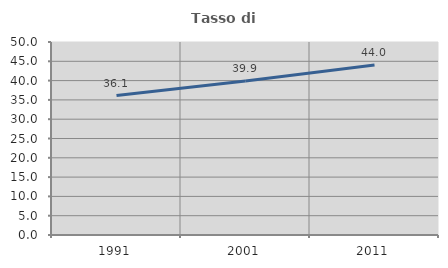
| Category | Tasso di occupazione   |
|---|---|
| 1991.0 | 36.117 |
| 2001.0 | 39.873 |
| 2011.0 | 44.015 |